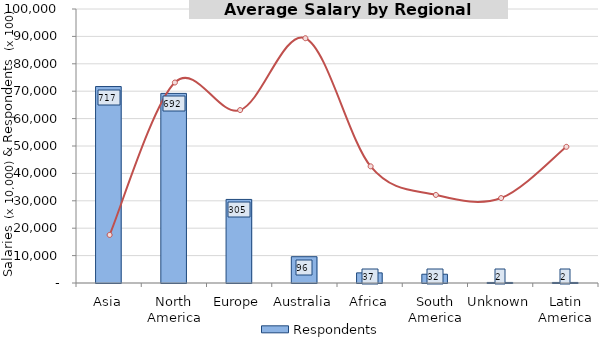
| Category | Respondents |
|---|---|
| Asia | 717 |
| North America | 692 |
| Europe | 305 |
| Australia | 96 |
| Africa | 37 |
| South America | 32 |
| Unknown | 2 |
| Latin America | 2 |